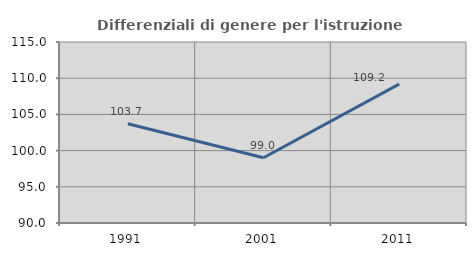
| Category | Differenziali di genere per l'istruzione superiore |
|---|---|
| 1991.0 | 103.698 |
| 2001.0 | 99.005 |
| 2011.0 | 109.173 |